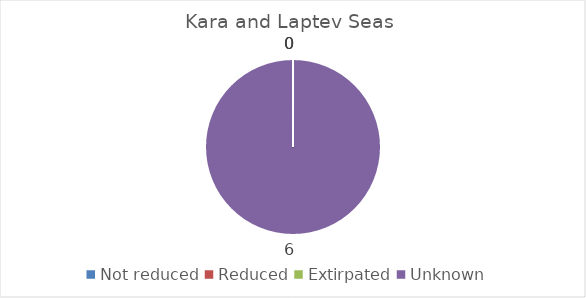
| Category | Kara and Laptev Seas |
|---|---|
| Not reduced | 0 |
| Reduced | 0 |
| Extirpated | 0 |
| Unknown | 6 |